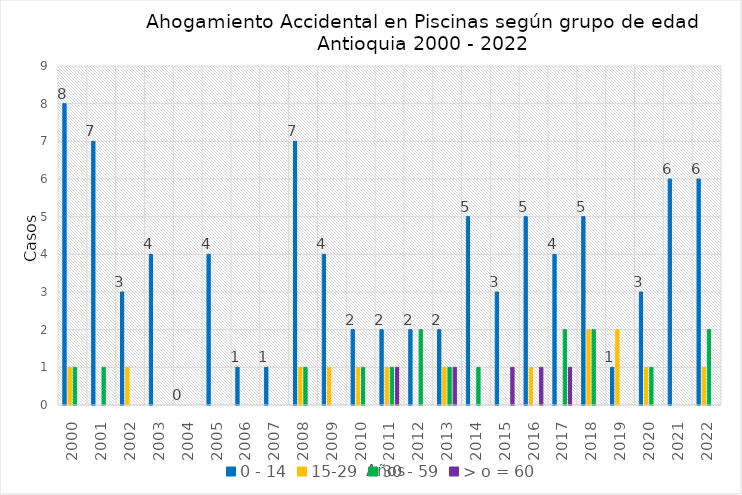
| Category | 0 - 14 | 15-29 | 30 - 59 | > o = 60 |
|---|---|---|---|---|
| 2000 | 8 | 1 | 1 | 0 |
| 2001 | 7 | 0 | 1 | 0 |
| 2002 | 3 | 1 | 0 | 0 |
| 2003 | 4 | 0 | 0 | 0 |
| 2004 | 0 | 0 | 0 | 0 |
| 2005 | 4 | 0 | 0 | 0 |
| 2006 | 1 | 0 | 0 | 0 |
| 2007 | 1 | 0 | 0 | 0 |
| 2008 | 7 | 1 | 1 | 0 |
| 2009 | 4 | 1 | 0 | 0 |
| 2010 | 2 | 1 | 1 | 0 |
| 2011 | 2 | 1 | 1 | 1 |
| 2012 | 2 | 0 | 2 | 0 |
| 2013 | 2 | 1 | 1 | 1 |
| 2014 | 5 | 0 | 1 | 0 |
| 2015 | 3 | 0 | 0 | 1 |
| 2016 | 5 | 1 | 0 | 1 |
| 2017 | 4 | 0 | 2 | 1 |
| 2018 | 5 | 2 | 2 | 0 |
| 2019 | 1 | 2 | 0 | 0 |
| 2020 | 3 | 1 | 1 | 0 |
| 2021 | 6 | 0 | 0 | 0 |
| 2022 | 6 | 1 | 2 | 0 |